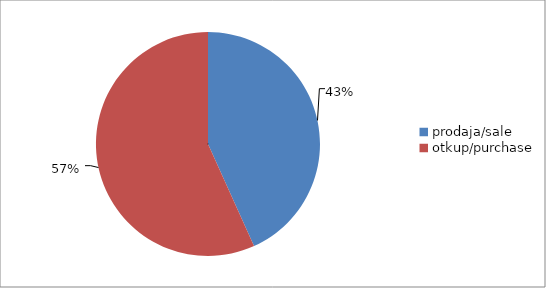
| Category | Series 0 |
|---|---|
| prodaja/sale | 9734190.4 |
| otkup/purchase | 12766792 |